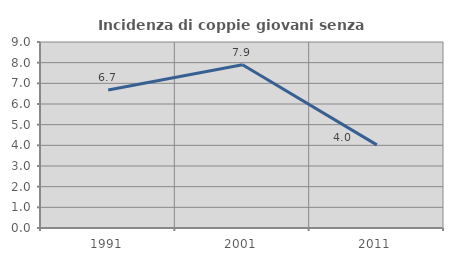
| Category | Incidenza di coppie giovani senza figli |
|---|---|
| 1991.0 | 6.674 |
| 2001.0 | 7.897 |
| 2011.0 | 4.022 |